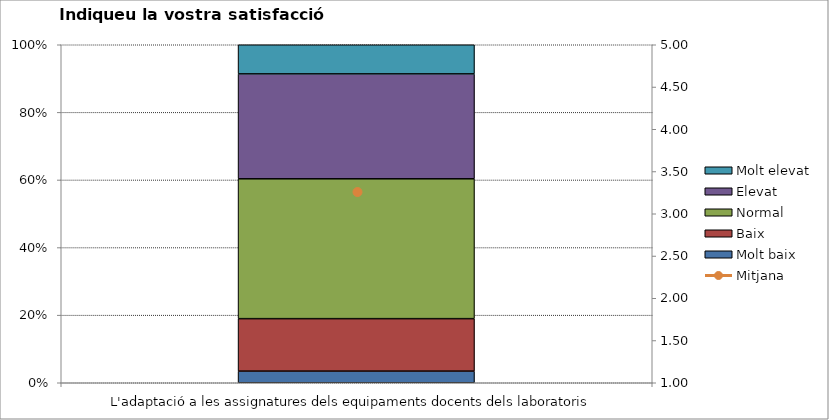
| Category | Molt baix | Baix | Normal  | Elevat | Molt elevat |
|---|---|---|---|---|---|
| L'adaptació a les assignatures dels equipaments docents dels laboratoris | 2 | 9 | 24 | 18 | 5 |